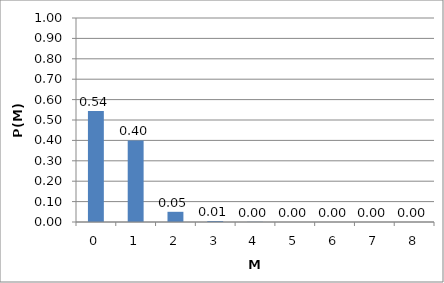
| Category | P(M) |
|---|---|
| 0.0 | 0.544 |
| 1.0 | 0.4 |
| 2.0 | 0.05 |
| 3.0 | 0.005 |
| 4.0 | 0.001 |
| 5.0 | 0 |
| 6.0 | 0 |
| 7.0 | 0 |
| 8.0 | 0 |